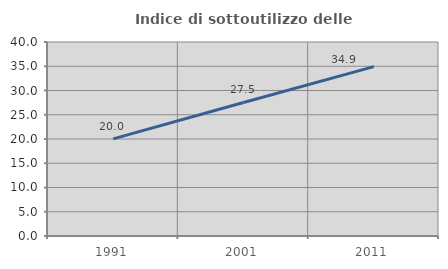
| Category | Indice di sottoutilizzo delle abitazioni  |
|---|---|
| 1991.0 | 20.017 |
| 2001.0 | 27.53 |
| 2011.0 | 34.912 |